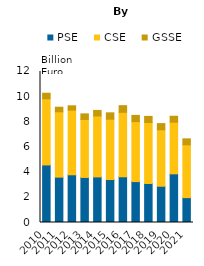
| Category | PSE | CSE | GSSE |
|---|---|---|---|
| 2010 | 4574.053 | 5259.611 | 439.343 |
| 2011 | 3606.871 | 5189.892 | 365.136 |
| 2012 | 3791.654 | 5137.241 | 343.692 |
| 2013 | 3580.819 | 4609.299 | 442.937 |
| 2014 | 3622.825 | 4843.185 | 441.098 |
| 2015 | 3414.567 | 4796.82 | 503.617 |
| 2016 | 3633.252 | 5123.204 | 528.527 |
| 2017 | 3250.643 | 4766.979 | 492.959 |
| 2018 | 3101.579 | 4844.615 | 486.097 |
| 2019 | 2882.346 | 4484.328 | 493.241 |
| 2020 | 3868.285 | 4106.677 | 467.586 |
| 2021 | 1975.923 | 4200.29 | 471.51 |